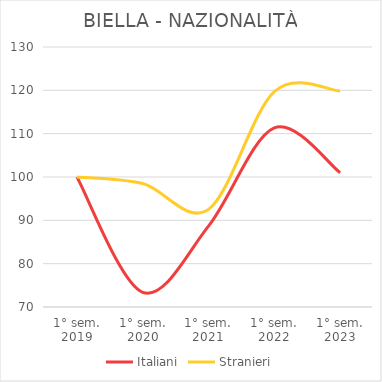
| Category | Italiani | Stranieri |
|---|---|---|
| 1° sem.
2019 | 100 | 100 |
| 1° sem.
2020 | 73.396 | 98.483 |
| 1° sem.
2021 | 88.675 | 92.532 |
| 1° sem.
2022 | 111.325 | 119.72 |
| 1° sem.
2023 | 101.007 | 119.837 |